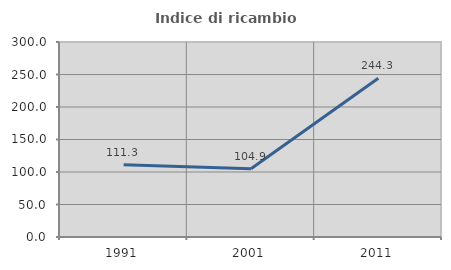
| Category | Indice di ricambio occupazionale  |
|---|---|
| 1991.0 | 111.333 |
| 2001.0 | 104.891 |
| 2011.0 | 244.34 |